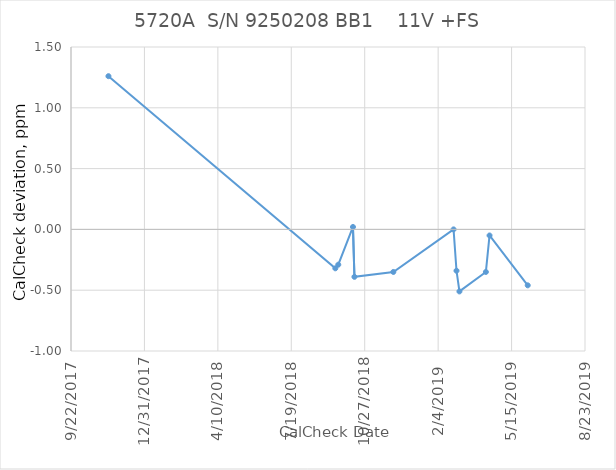
| Category |    11V +FS |
|---|---|
| 43051.0 | 1.26 |
| 43360.0 | -0.32 |
| 43364.0 | -0.29 |
| 43384.0 | 0.02 |
| 43386.0 | -0.39 |
| 43439.0 | -0.35 |
| 43521.0 | 0 |
| 43525.0 | -0.34 |
| 43529.0 | -0.51 |
| 43565.0 | -0.35 |
| 43570.0 | -0.05 |
| 43622.0 | -0.46 |